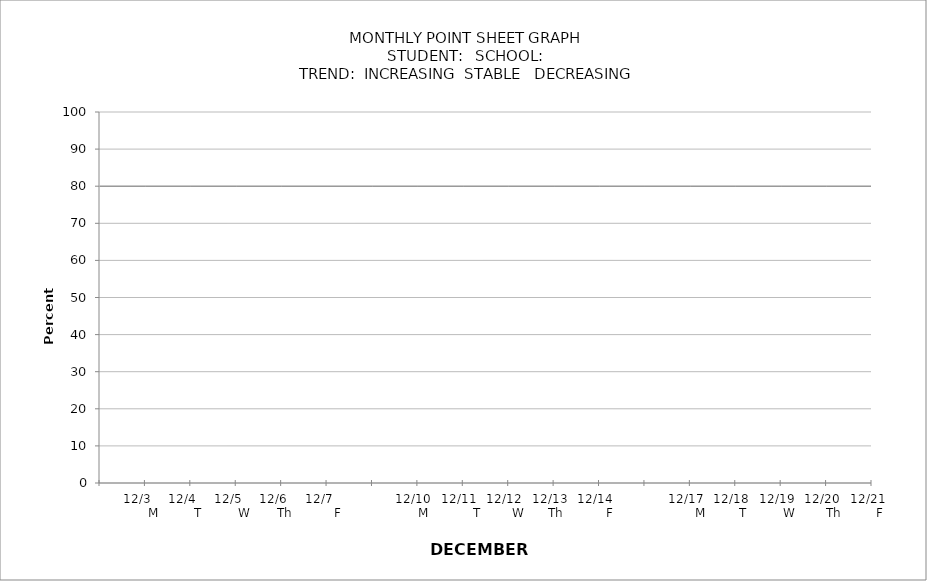
| Category | PERCENTAGE | target |
|---|---|---|
|  |  | 80 |
| 12/3         M |  | 80 |
| 12/4         T |  | 80 |
| 12/5         W |  | 80 |
| 12/6       Th |  | 80 |
| 12/7          F |  | 80 |
|  |  | 80 |
| 12/10      M |  | 80 |
| 12/11          T |  | 80 |
| 12/12        W |  | 80 |
| 12/13    Th |  | 80 |
| 12/14        F |  | 80 |
|  |  | 80 |
| 12/17        M |  | 80 |
| 12/18       T |  | 80 |
| 12/19       W |  | 80 |
| 12/20       Th |  | 80 |
| 12/21       F |  | 80 |